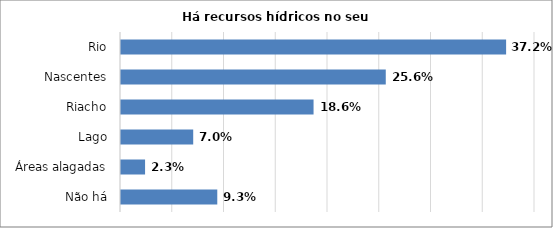
| Category | Series 0 |
|---|---|
| Não há | 0.093 |
| Áreas alagadas | 0.023 |
| Lago | 0.07 |
| Riacho | 0.186 |
| Nascentes | 0.256 |
| Rio | 0.372 |